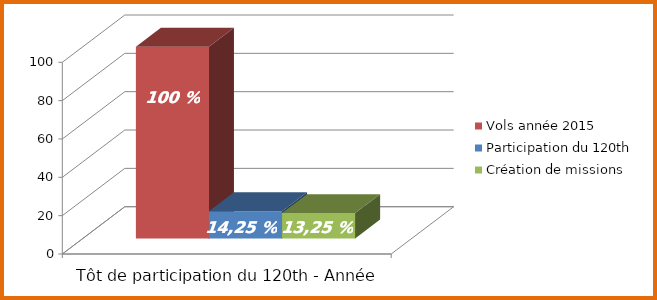
| Category | Vols année 2015 | Participation du 120th | Création de missions |
|---|---|---|---|
| 0 | 100 |  |  |